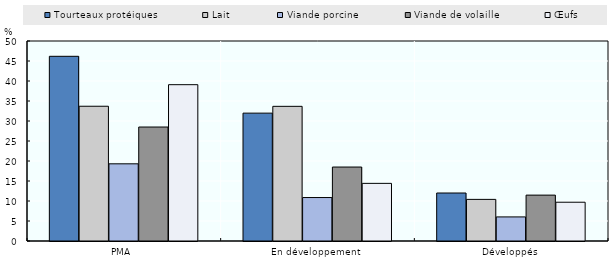
| Category | Tourteaux protéiques | Lait | Viande porcine | Viande de volaille | Œufs |
|---|---|---|---|---|---|
| PMA | 46.175 | 33.69 | 19.295 | 28.494 | 39.081 |
| En développement | 31.967 | 33.666 | 10.865 | 18.492 | 14.407 |
| Développés | 11.999 | 10.405 | 6.021 | 11.469 | 9.693 |